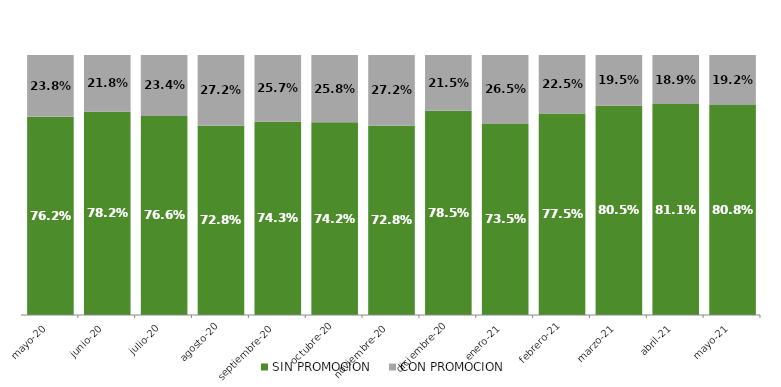
| Category | SIN PROMOCION   | CON PROMOCION   |
|---|---|---|
| 2020-05-01 | 0.762 | 0.238 |
| 2020-06-01 | 0.782 | 0.218 |
| 2020-07-01 | 0.766 | 0.234 |
| 2020-08-01 | 0.728 | 0.272 |
| 2020-09-01 | 0.743 | 0.257 |
| 2020-10-01 | 0.742 | 0.258 |
| 2020-11-01 | 0.728 | 0.272 |
| 2020-12-01 | 0.785 | 0.215 |
| 2021-01-01 | 0.735 | 0.265 |
| 2021-02-01 | 0.775 | 0.225 |
| 2021-03-01 | 0.805 | 0.195 |
| 2021-04-01 | 0.811 | 0.189 |
| 2021-05-01 | 0.808 | 0.192 |